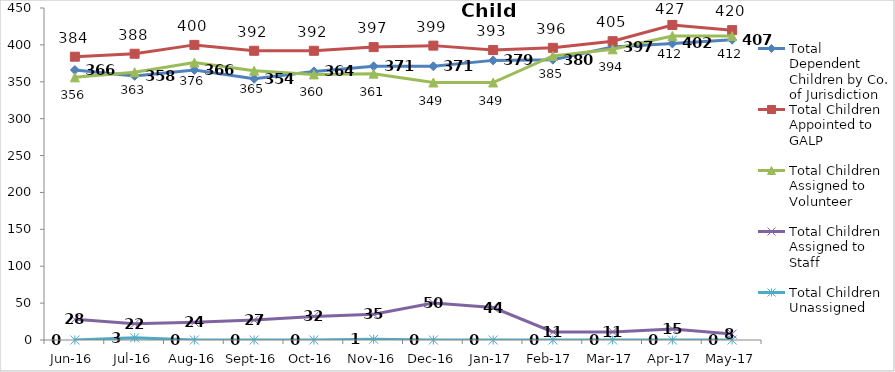
| Category | Total Dependent Children by Co. of Jurisdiction | Total Children Appointed to GALP | Total Children Assigned to Volunteer | Total Children Assigned to Staff | Total Children Unassigned |
|---|---|---|---|---|---|
| Jun-16 | 366 | 384 | 356 | 28 | 0 |
| Jul-16 | 358 | 388 | 363 | 22 | 3 |
| Aug-16 | 366 | 400 | 376 | 24 | 0 |
| Sep-16 | 354 | 392 | 365 | 27 | 0 |
| Oct-16 | 364 | 392 | 360 | 32 | 0 |
| Nov-16 | 371 | 397 | 361 | 35 | 1 |
| Dec-16 | 371 | 399 | 349 | 50 | 0 |
| Jan-17 | 379 | 393 | 349 | 44 | 0 |
| Feb-17 | 380 | 396 | 385 | 11 | 0 |
| Mar-17 | 397 | 405 | 394 | 11 | 0 |
| Apr-17 | 402 | 427 | 412 | 15 | 0 |
| May-17 | 407 | 420 | 412 | 8 | 0 |